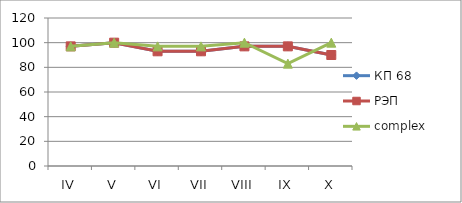
| Category | КП 68 | РЭП  | complex |
|---|---|---|---|
| IV | 97 | 97 | 97 |
| V | 100 | 100 | 100 |
| VI | 93 | 93 | 97 |
| VII | 93 | 93 | 97 |
| VIII | 97 | 97 | 100 |
| IX | 97 | 97 | 83 |
| X | 90 | 90 | 100 |